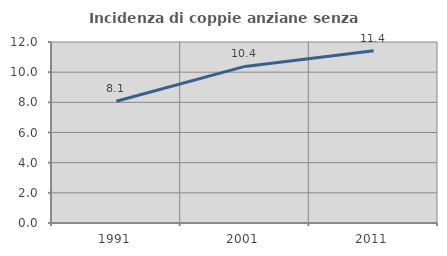
| Category | Incidenza di coppie anziane senza figli  |
|---|---|
| 1991.0 | 8.068 |
| 2001.0 | 10.382 |
| 2011.0 | 11.427 |